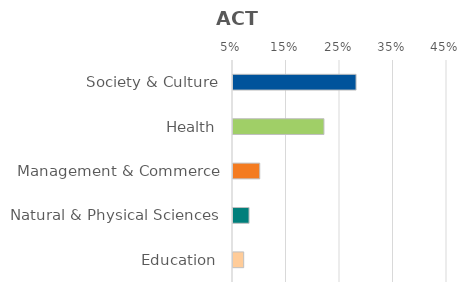
| Category | Series 0 |
|---|---|
| Society & Culture | 0.28 |
| Health | 0.22 |
| Management & Commerce | 0.1 |
| Natural & Physical Sciences | 0.08 |
| Education | 0.07 |